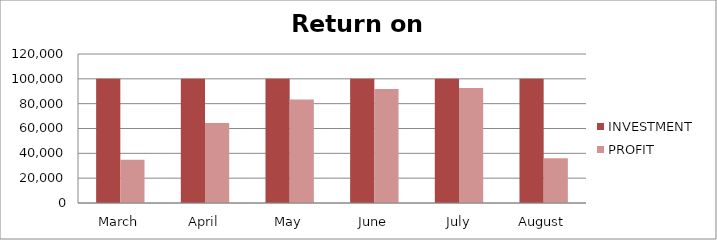
| Category | INVESTMENT  | PROFIT |
|---|---|---|
| March | 100000 | 34885 |
| April | 100000 | 64475 |
| May | 100000 | 83275 |
| June | 100000 | 91850 |
| July | 100000 | 92549 |
| August | 100000 | 35958 |